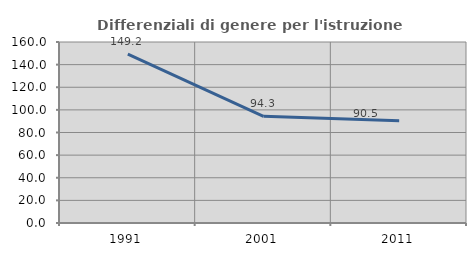
| Category | Differenziali di genere per l'istruzione superiore |
|---|---|
| 1991.0 | 149.214 |
| 2001.0 | 94.286 |
| 2011.0 | 90.477 |